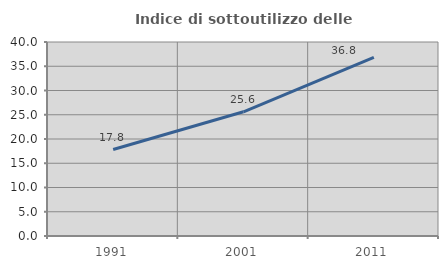
| Category | Indice di sottoutilizzo delle abitazioni  |
|---|---|
| 1991.0 | 17.822 |
| 2001.0 | 25.607 |
| 2011.0 | 36.842 |